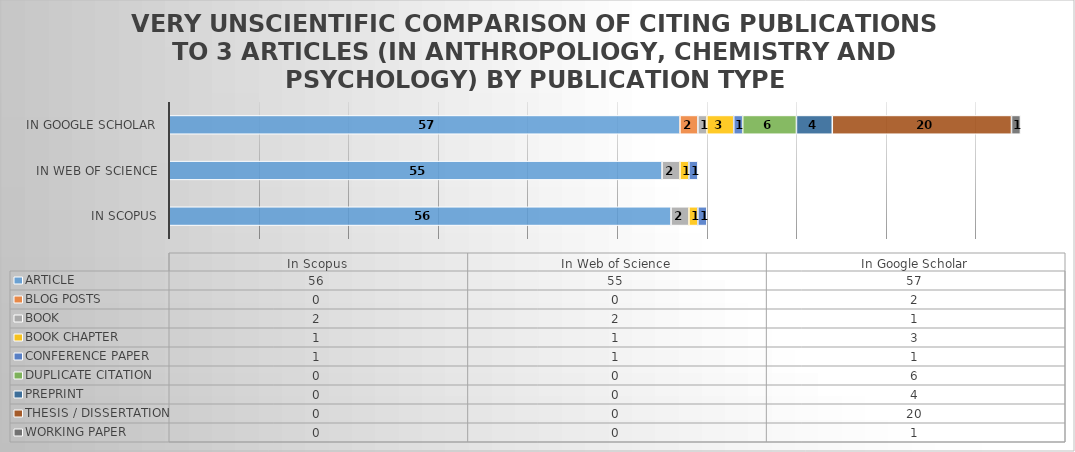
| Category | ARTICLE | BLOG POSTS | BOOK | BOOK CHAPTER | CONFERENCE PAPER | DUPLICATE CITATION | PREPRINT | THESIS / DISSERTATION | WORKING PAPER |
|---|---|---|---|---|---|---|---|---|---|
| In Scopus | 56 | 0 | 2 | 1 | 1 | 0 | 0 | 0 | 0 |
| In Web of Science | 55 | 0 | 2 | 1 | 1 | 0 | 0 | 0 | 0 |
| In Google Scholar | 57 | 2 | 1 | 3 | 1 | 6 | 4 | 20 | 1 |